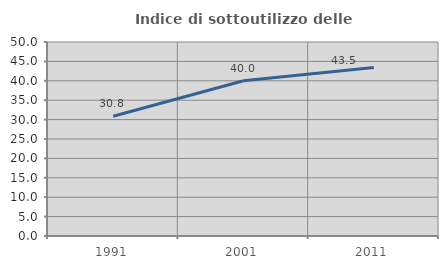
| Category | Indice di sottoutilizzo delle abitazioni  |
|---|---|
| 1991.0 | 30.846 |
| 2001.0 | 40 |
| 2011.0 | 43.453 |